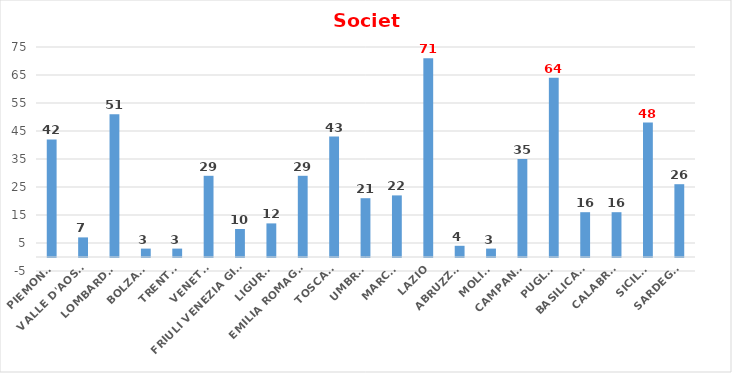
| Category | Series 0 |
|---|---|
| PIEMONTE | 42 |
| VALLE D'AOSTA | 7 |
| LOMBARDIA | 51 |
| BOLZANO | 3 |
| TRENTO | 3 |
| VENETO | 29 |
| FRIULI VENEZIA GIULIA | 10 |
| LIGURIA | 12 |
| EMILIA ROMAGNA | 29 |
| TOSCANA | 43 |
| UMBRIA | 21 |
| MARCHE | 22 |
| LAZIO | 71 |
| ABRUZZO | 4 |
| MOLISE | 3 |
| CAMPANIA | 35 |
| PUGLIA | 64 |
| BASILICATA | 16 |
| CALABRIA | 16 |
| SICILIA | 48 |
| SARDEGNA | 26 |